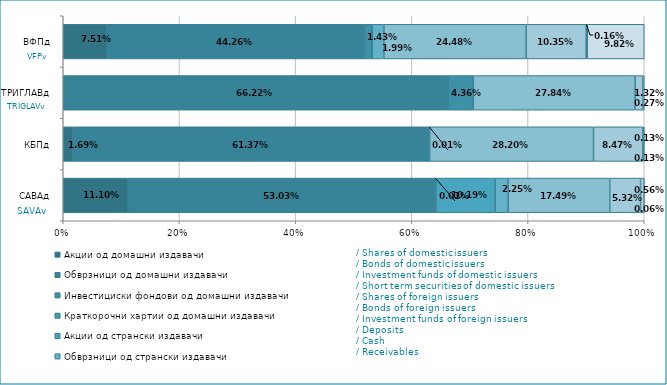
| Category | Акции од домашни издавачи  | Обврзници од домашни издавачи  | Инвестициски фондови од домашни издавачи   | Краткорочни хартии од домашни издавачи   | Акции од странски издавачи   | Обврзници од странски издавачи  | Инвестициски фондови од странски издавaчи  | Депозити | Парични средства | Побарувања |
|---|---|---|---|---|---|---|---|---|---|---|
| САВАд | 0.111 | 0.53 | 0 | 0 | 0.102 | 0.023 | 0.175 | 0.053 | 0.006 | 0.001 |
| КБПд | 0.017 | 0.614 | 0 | 0 | 0 | 0 | 0.282 | 0.085 | 0.001 | 0.001 |
| ТРИГЛАВд | 0 | 0.662 | 0.044 | 0 | 0 | 0 | 0.278 | 0.013 | 0.003 | 0 |
| ВФПд | 0.075 | 0.443 | 0.014 | 0 | 0 | 0.02 | 0.245 | 0.103 | 0.002 | 0.098 |